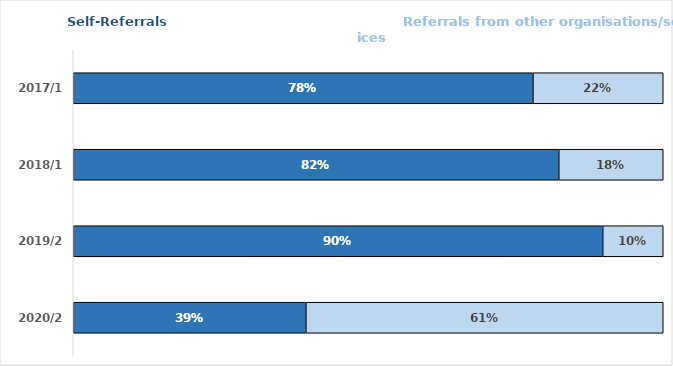
| Category | Series 0 | Series 1 |
|---|---|---|
| 2017/18 | 0.779 | 0.221 |
| 2018/19 | 0.823 | 0.177 |
| 2019/20 | 0.897 | 0.103 |
| 2020/21 | 0.394 | 0.606 |